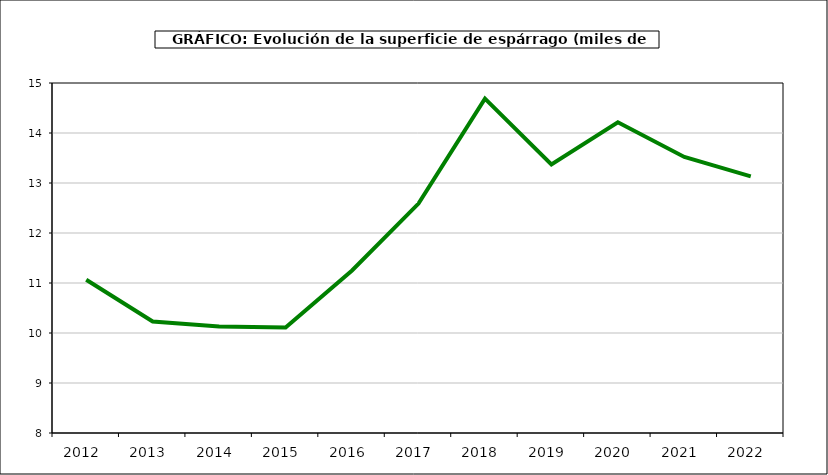
| Category | superficie |
|---|---|
| 2012.0 | 11.065 |
| 2013.0 | 10.231 |
| 2014.0 | 10.132 |
| 2015.0 | 10.112 |
| 2016.0 | 11.251 |
| 2017.0 | 12.589 |
| 2018.0 | 14.688 |
| 2019.0 | 13.373 |
| 2020.0 | 14.215 |
| 2021.0 | 13.52 |
| 2022.0 | 13.131 |